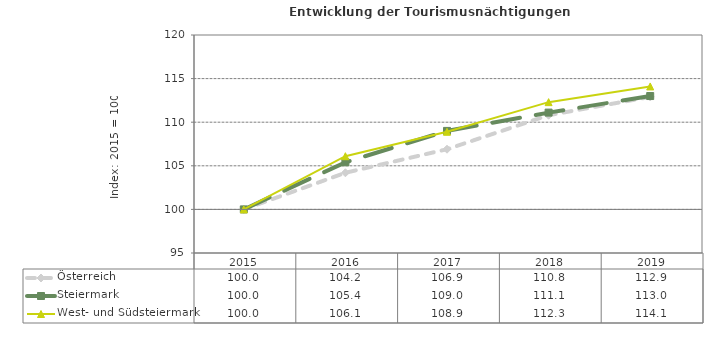
| Category | Österreich | Steiermark | West- und Südsteiermark |
|---|---|---|---|
| 2019.0 | 112.9 | 113 | 114.1 |
| 2018.0 | 110.8 | 111.1 | 112.3 |
| 2017.0 | 106.9 | 109 | 108.9 |
| 2016.0 | 104.2 | 105.4 | 106.1 |
| 2015.0 | 100 | 100 | 100 |